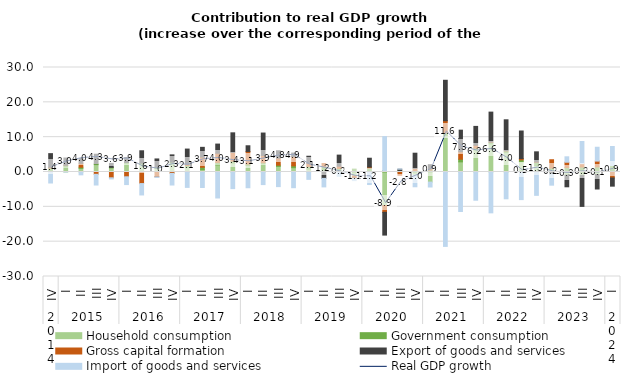
| Category | Household consumption | Government consumption | Gross capital formation | Export of goods and services | Import of goods and services |
|---|---|---|---|---|---|
| 0 | 0.489 | 0.609 | 0.236 | 3.937 | -3.157 |
| 1 | 1.471 | 0.435 | 0.021 | 2.085 | -0.015 |
| 2 | 1.039 | 0.337 | 1.113 | 1.391 | -0.814 |
| 3 | 2.119 | 0.287 | -0.668 | 2.703 | -3.069 |
| 4 | 1.174 | 0.162 | -1.667 | 1.146 | -0.326 |
| 5 | 2.517 | 0.208 | -1.375 | 1.444 | -2.234 |
| 6 | 2.29 | 0.235 | -3.321 | 3.567 | -3.269 |
| 7 | 1.008 | 0.329 | -1.383 | 2.41 | -0.187 |
| 8 | 2.282 | 0.532 | -0.392 | 2.102 | -3.346 |
| 9 | 1.274 | 0.59 | 0.265 | 4.453 | -4.42 |
| 10 | 0.66 | 0.699 | 2.928 | 2.793 | -4.446 |
| 11 | 2.049 | 0.676 | 2.66 | 2.63 | -7.459 |
| 12 | 2.582 | 0.547 | 2.487 | 5.63 | -4.77 |
| 13 | 1.86 | 0.414 | 3.626 | 1.63 | -4.52 |
| 14 | 2.365 | 0.32 | 2.07 | 6.429 | -3.614 |
| 15 | 1.604 | 0.353 | 2.056 | 2.092 | -4.195 |
| 16 | 1.243 | 0.516 | 2.69 | 0.982 | -4.505 |
| 17 | 0.791 | 0.795 | 0.886 | 2.048 | -2.113 |
| 18 | 0.591 | 0.939 | 0.912 | -1.833 | -2.444 |
| 19 | 0.05 | 0.955 | 0.657 | 3.187 | -1.249 |
| 20 | -1.163 | 0.829 | -0.626 | -0.101 | -0.578 |
| 21 | 0.482 | 0.599 | 0.344 | 2.53 | -3.598 |
| 22 | -9.615 | 0.379 | -1.955 | -6.54 | 9.788 |
| 23 | 0.094 | 0.31 | -0.951 | 0.395 | 0.073 |
| 24 | -0.89 | 0.434 | 0.592 | 4.369 | -3.35 |
| 25 | -2.898 | 0.554 | 0.392 | 1.157 | -1.408 |
| 26 | 10.516 | 0.77 | 3.443 | 11.604 | -21.36 |
| 27 | 2.909 | 0.76 | 2.168 | 6.172 | -11.344 |
| 28 | 6.329 | 0.522 | 0.833 | 5.406 | -8.104 |
| 29 | 8.072 | 0.422 | 0.12 | 8.579 | -11.727 |
| 30 | 5.57 | 0.454 | 0.073 | 8.89 | -7.693 |
| 31 | 2.942 | 0.538 | 0.373 | 7.916 | -7.924 |
| 32 | 1.864 | 0.863 | 0.127 | 2.936 | -6.702 |
| 33 | -0.118 | 1.122 | 2.397 | -0.472 | -3.192 |
| 34 | -0.923 | 1.272 | 1.531 | -3.326 | 1.558 |
| 35 | -0.968 | 1.431 | 0.963 | -8.906 | 6.36 |
| 36 | -0.712 | 1.471 | 1.662 | -4.168 | 3.97 |
| 37 | 0.329 | 1.503 | -1.718 | -2.346 | 5.492 |